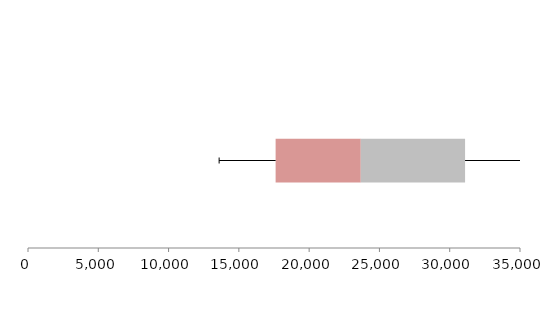
| Category | Series 1 | Series 2 | Series 3 |
|---|---|---|---|
| 0 | 17615.278 | 6058.099 | 7418.866 |